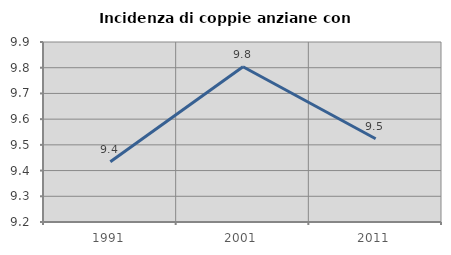
| Category | Incidenza di coppie anziane con figli |
|---|---|
| 1991.0 | 9.434 |
| 2001.0 | 9.804 |
| 2011.0 | 9.524 |